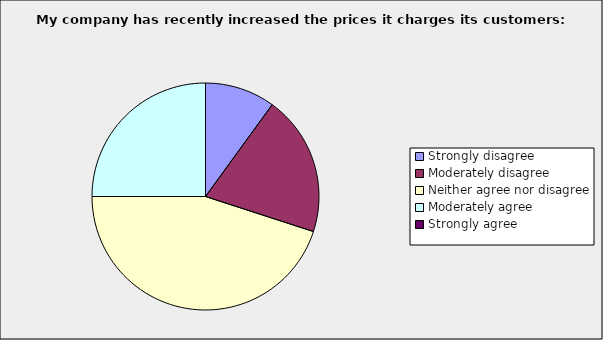
| Category | Series 0 |
|---|---|
| Strongly disagree | 0.1 |
| Moderately disagree | 0.2 |
| Neither agree nor disagree | 0.45 |
| Moderately agree | 0.25 |
| Strongly agree | 0 |